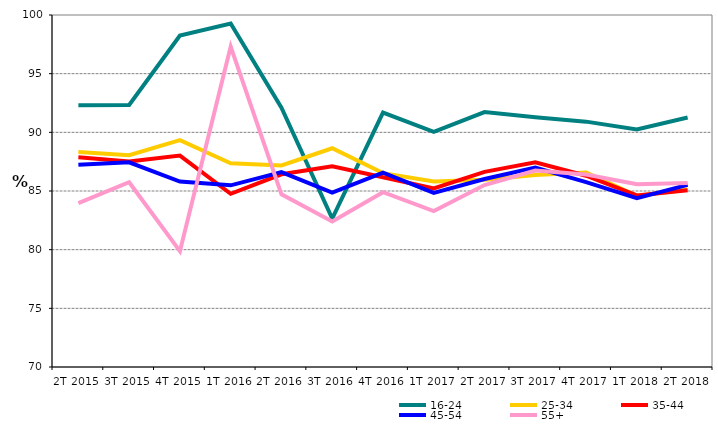
| Category | 16-24 | 25-34 | 35-44 | 45-54 | 55+ |
|---|---|---|---|---|---|
| 2T 2015 | 92.303 | 88.327 | 87.877 | 87.235 | 83.963 |
| 3T 2015 | 92.327 | 88.056 | 87.511 | 87.447 | 85.746 |
| 4T 2015 | 98.247 | 89.332 | 88.017 | 85.8 | 79.865 |
| 1T 2016 | 99.276 | 87.367 | 84.757 | 85.483 | 97.306 |
| 2T 2016 | 92.105 | 87.18 | 86.423 | 86.61 | 84.713 |
| 3T 2016 | 82.646 | 88.643 | 87.112 | 84.87 | 82.409 |
| 4T 2016 | 91.689 | 86.523 | 86.173 | 86.567 | 84.895 |
| 1T 2017 | 90.032 | 85.808 | 85.213 | 84.837 | 83.294 |
| 2T 2017 | 91.722 | 85.96 | 86.631 | 86.021 | 85.504 |
| 3T 2017 | 91.284 | 86.362 | 87.454 | 87.005 | 86.75 |
| 4T 2017 | 90.911 | 86.567 | 86.302 | 85.756 | 86.412 |
| 1T 2018 | 90.253 | 84.582 | 84.627 | 84.392 | 85.573 |
| 2T 2018 | 91.259 | 85.119 | 85.062 | 85.527 | 85.689 |